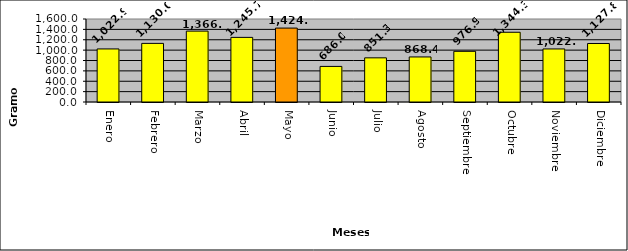
| Category | Crack |
|---|---|
| Enero | 1022.9 |
| Febrero | 1130 |
| Marzo | 1366.4 |
| Abril | 1245.7 |
| Mayo | 1424.8 |
| Junio | 686 |
| Julio | 851.3 |
| Agosto | 868.4 |
| Septiembre | 976.9 |
| Octubre | 1344.3 |
| Noviembre | 1022.8 |
| Diciembre | 1127.8 |